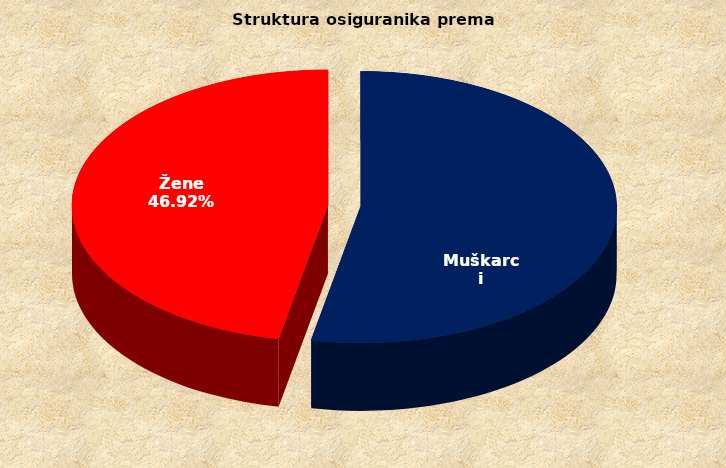
| Category | Series 0 |
|---|---|
| Muškarci | 913862 |
| Žene | 807664 |